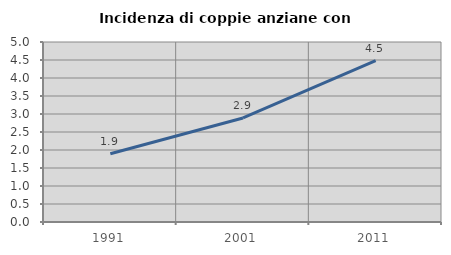
| Category | Incidenza di coppie anziane con figli |
|---|---|
| 1991.0 | 1.895 |
| 2001.0 | 2.89 |
| 2011.0 | 4.48 |